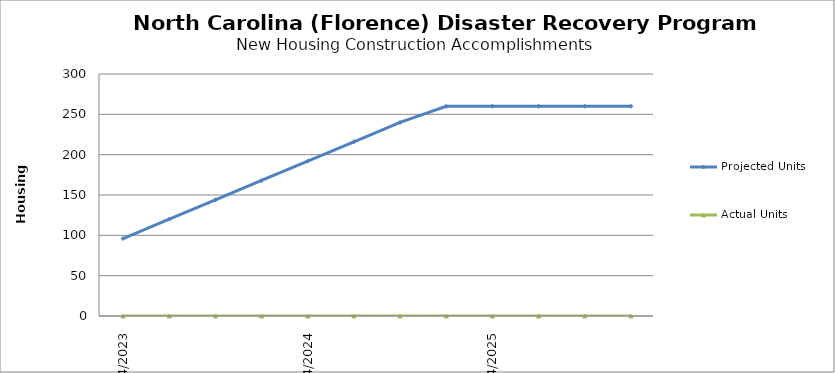
| Category | Projected Units | Actual Units |
|---|---|---|
| 4/2023 | 96 | 0 |
| 7/2023 | 120 | 0 |
| 10/2023 | 144 | 0 |
| 1/2024 | 168 | 0 |
| 4/2024 | 192 | 0 |
| 7/2024 | 216 | 0 |
| 10/2024 | 240 | 0 |
| 1/2025 | 260 | 0 |
| 4/2025 | 260 | 0 |
| 7/2025 | 260 | 0 |
| 10/2025 | 260 | 0 |
| 1/2026 | 260 | 0 |